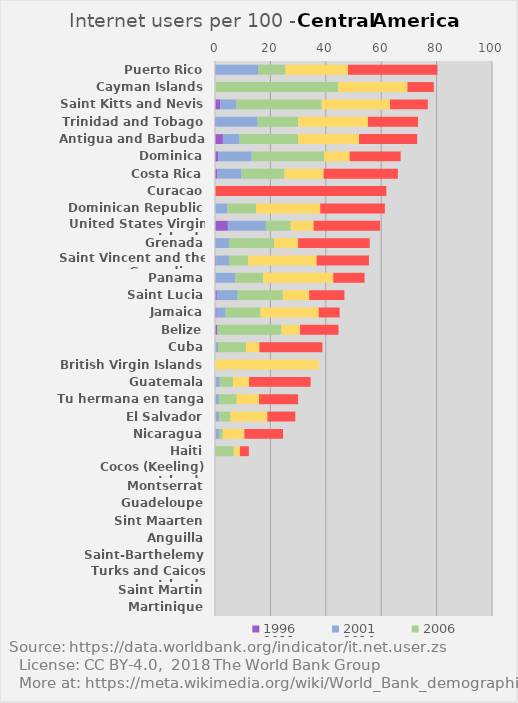
| Category | 1996 | 2001 | 2006 | 2011 | 2016 |
|---|---|---|---|---|---|
| Puerto Rico | 0.27 | 15.36 | 9.81 | 22.56 | 32.32 |
| Cayman Islands | 0 | 0 | 44.5 | 24.97 | 9.53 |
| Saint Kitts and Nevis | 1.95 | 5.76 | 30.79 | 24.7 | 13.62 |
| Trinidad and Tobago | 0.39 | 14.99 | 14.62 | 25.2 | 18.1 |
| Antigua and Barbuda | 2.86 | 6.04 | 21.1 | 22 | 21 |
| Dominica | 1.17 | 12.08 | 26.15 | 9.2 | 18.43 |
| Costa Rica | 0.84 | 8.72 | 15.54 | 14.11 | 26.82 |
| Curacao | 0 | 0 | 0 | 0 | 61.86 |
| Dominican Republic | 0.07 | 4.36 | 10.41 | 23.16 | 23.33 |
| United States Virgin Islands | 4.65 | 13.73 | 8.95 | 8.27 | 24.01 |
| Grenada | 0.3 | 4.83 | 16.27 | 8.6 | 25.86 |
| Saint Vincent and the Grenadines | 0.48 | 4.61 | 6.91 | 24.7 | 18.87 |
| Panama | 0.22 | 7.05 | 10.08 | 25.35 | 11.3 |
| Saint Lucia | 0.67 | 7.51 | 16.32 | 9.5 | 12.73 |
| Jamaica | 0.59 | 3.27 | 12.54 | 21.04 | 7.56 |
| Belize | 0.88 | 0 | 23.12 | 6.7 | 13.88 |
| Cuba | 0.03 | 1.05 | 10.08 | 4.86 | 22.75 |
| British Virgin Islands | 0 | 0 | 0 | 37.4 | 0 |
| Guatemala | 0.02 | 1.72 | 4.76 | 5.8 | 22.21 |
| Tu hermana en tanga | 0.04 | 1.38 | 6.38 | 8.1 | 14.1 |
| El Salvador | 0.09 | 1.41 | 4 | 13.4 | 10.1 |
| Nicaragua | 0.08 | 1.37 | 1.36 | 7.79 | 13.97 |
| Haiti | 0.01 | 0.33 | 6.46 | 2.2 | 3.23 |
| Cocos (Keeling) Islands | 0 | 0 | 0 | 0 | 0 |
| Montserrat | 0 | 0 | 0 | 0 | 0 |
| Guadeloupe | 0 | 0 | 0 | 0 | 0 |
| Sint Maarten | 0 | 0 | 0 | 0 | 0 |
| Anguilla | 0 | 0 | 0 | 0 | 0 |
| Saint-Barthelemy | 0 | 0 | 0 | 0 | 0 |
| Turks and Caicos Islands | 0 | 0 | 0 | 0 | 0 |
| Saint Martin | 0 | 0 | 0 | 0 | 0 |
| Martinique | 0 | 0 | 0 | 0 | 0 |